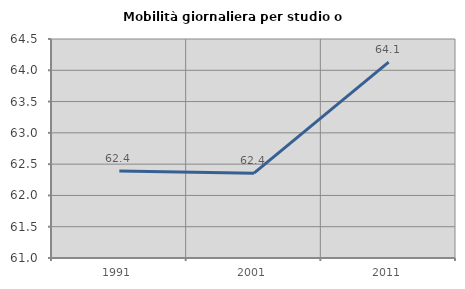
| Category | Mobilità giornaliera per studio o lavoro |
|---|---|
| 1991.0 | 62.391 |
| 2001.0 | 62.356 |
| 2011.0 | 64.131 |